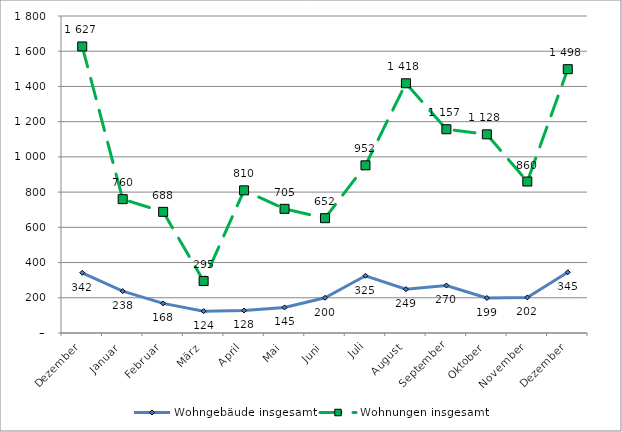
| Category | Wohngebäude insgesamt | Wohnungen insgesamt |
|---|---|---|
| Dezember | 342 | 1627 |
| Januar | 238 | 760 |
| Februar | 168 | 688 |
| März | 124 | 295 |
| April | 128 | 810 |
| Mai | 145 | 705 |
| Juni | 200 | 652 |
| Juli | 325 | 952 |
| August | 249 | 1418 |
| September | 270 | 1157 |
| Oktober | 199 | 1128 |
| November | 202 | 860 |
| Dezember | 345 | 1498 |